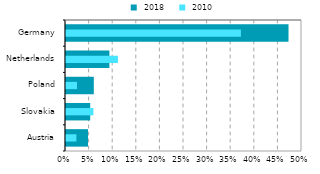
| Category |  2018 |
|---|---|
| Austria | 0.047 |
| Slovakia | 0.051 |
| Poland | 0.059 |
| Netherlands | 0.092 |
| Germany | 0.471 |